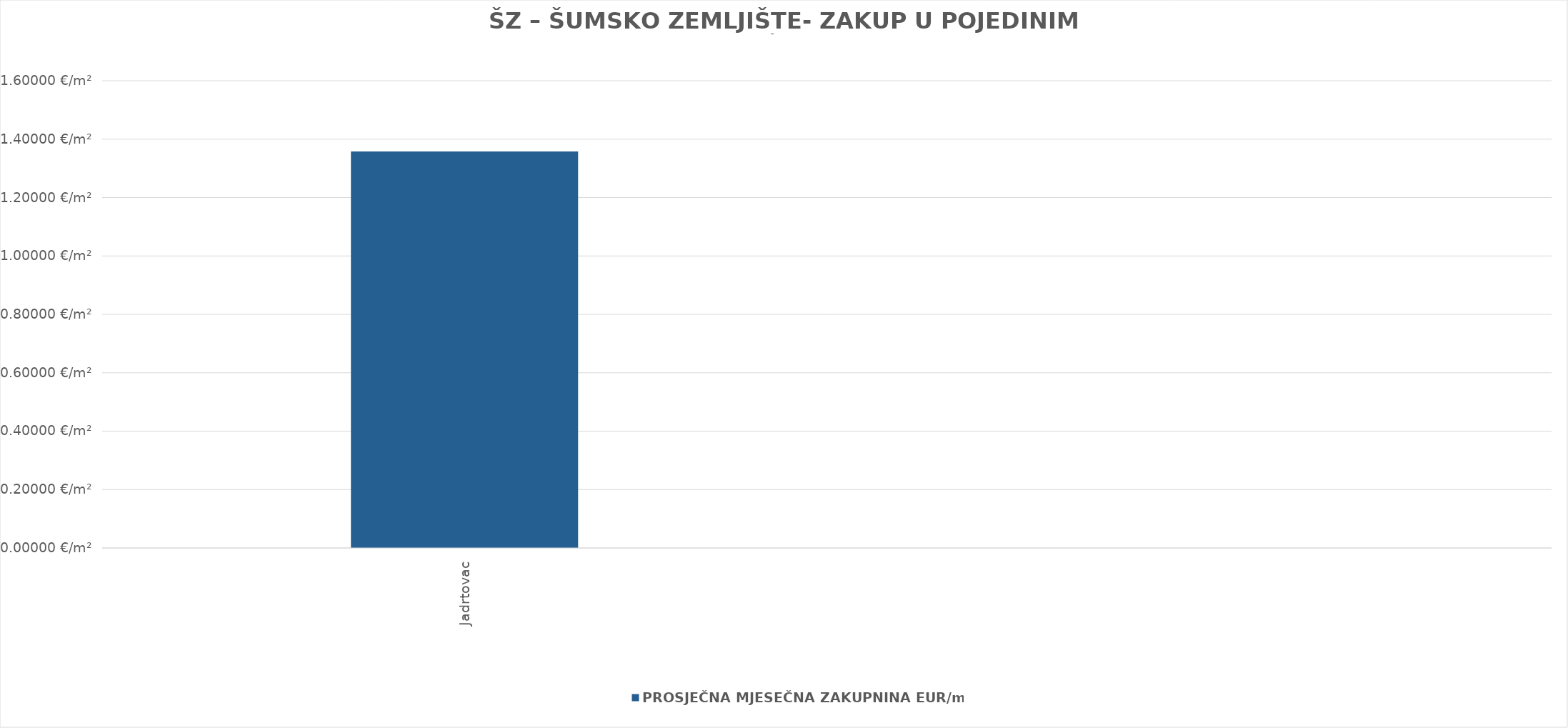
| Category | PROSJEČNA MJESEČNA ZAKUPNINA EUR/m² |
|---|---|
| Jadrtovac | 1900-01-01 08:35:37 |